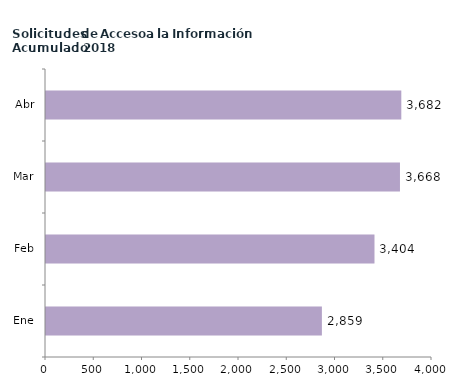
| Category | Series 0 |
|---|---|
| Ene | 2859 |
| Feb | 3404 |
| Mar | 3668 |
| Abr | 3682 |